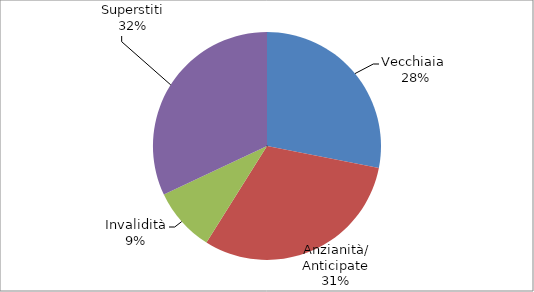
| Category | Series 0 |
|---|---|
| Vecchiaia  | 15609 |
| Anzianità/ Anticipate | 17133 |
| Invalidità | 5055 |
| Superstiti | 17783 |